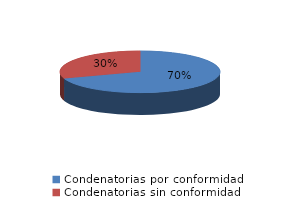
| Category | Series 0 |
|---|---|
| 0 | 30 |
| 1 | 13 |